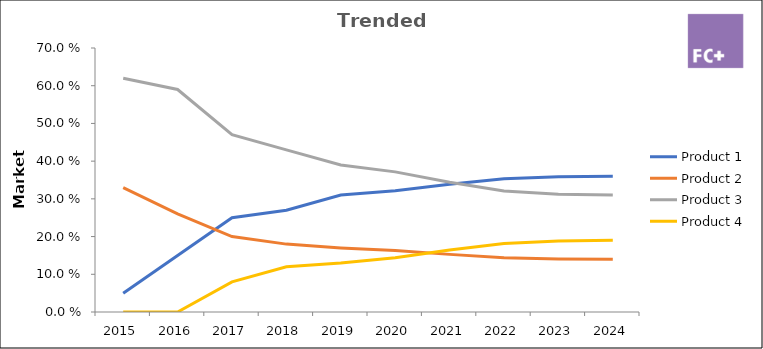
| Category | Product 1 | Product 2 | Product 3 | Product 4 |
|---|---|---|---|---|
| 2015.0 | 0.05 | 0.33 | 0.62 | 0 |
| 2016.0 | 0.15 | 0.26 | 0.59 | 0 |
| 2017.0 | 0.25 | 0.2 | 0.47 | 0.08 |
| 2018.0 | 0.27 | 0.18 | 0.43 | 0.12 |
| 2019.0 | 0.31 | 0.17 | 0.39 | 0.13 |
| 2020.0 | 0.322 | 0.163 | 0.372 | 0.144 |
| 2021.0 | 0.339 | 0.153 | 0.344 | 0.164 |
| 2022.0 | 0.353 | 0.144 | 0.321 | 0.182 |
| 2023.0 | 0.359 | 0.141 | 0.312 | 0.188 |
| 2024.0 | 0.36 | 0.14 | 0.31 | 0.19 |